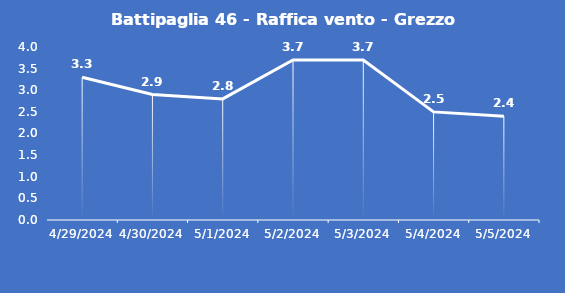
| Category | Battipaglia 46 - Raffica vento - Grezzo (m/s) |
|---|---|
| 4/29/24 | 3.3 |
| 4/30/24 | 2.9 |
| 5/1/24 | 2.8 |
| 5/2/24 | 3.7 |
| 5/3/24 | 3.7 |
| 5/4/24 | 2.5 |
| 5/5/24 | 2.4 |